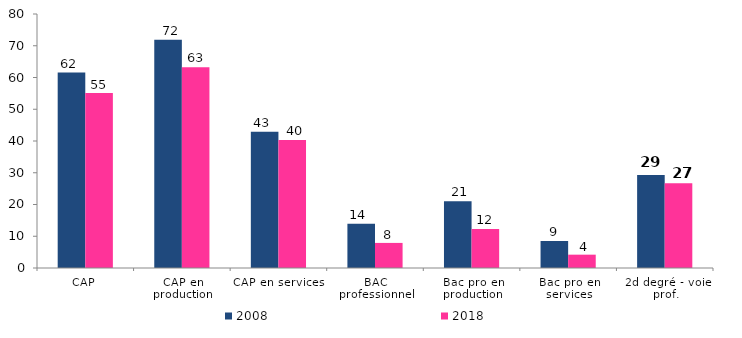
| Category | 2008 | 2018 |
|---|---|---|
| CAP | 61.6 | 55.1 |
| CAP en production | 71.9 | 63.2 |
| CAP en services | 42.9 | 40.3 |
| BAC professionnel | 13.9 | 7.9 |
| Bac pro en production | 21 | 12.3 |
| Bac pro en services | 8.5 | 4.2 |
| 2d degré - voie prof. | 29.3 | 26.7 |